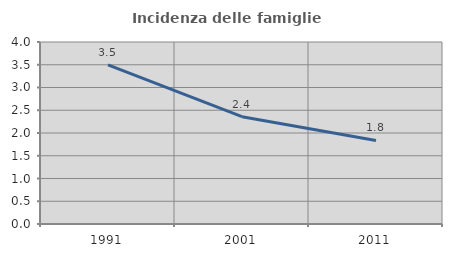
| Category | Incidenza delle famiglie numerose |
|---|---|
| 1991.0 | 3.497 |
| 2001.0 | 2.358 |
| 2011.0 | 1.837 |